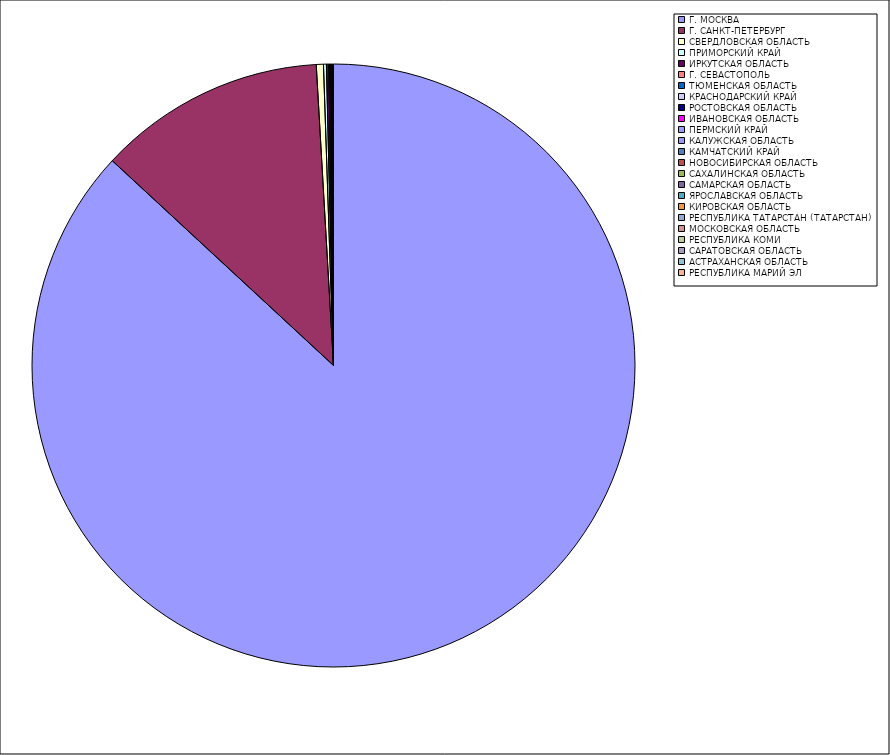
| Category | Оборот |
|---|---|
| Г. МОСКВА | 86.872 |
| Г. САНКТ-ПЕТЕРБУРГ | 12.199 |
| СВЕРДЛОВСКАЯ ОБЛАСТЬ | 0.382 |
| ПРИМОРСКИЙ КРАЙ | 0.156 |
| ИРКУТСКАЯ ОБЛАСТЬ | 0.12 |
| Г. СЕВАСТОПОЛЬ | 0.048 |
| ТЮМЕНСКАЯ ОБЛАСТЬ | 0.043 |
| КРАСНОДАРСКИЙ КРАЙ | 0.038 |
| РОСТОВСКАЯ ОБЛАСТЬ | 0.021 |
| ИВАНОВСКАЯ ОБЛАСТЬ | 0.019 |
| ПЕРМСКИЙ КРАЙ | 0.011 |
| КАЛУЖСКАЯ ОБЛАСТЬ | 0.011 |
| КАМЧАТСКИЙ КРАЙ | 0.009 |
| НОВОСИБИРСКАЯ ОБЛАСТЬ | 0.009 |
| САХАЛИНСКАЯ ОБЛАСТЬ | 0.008 |
| САМАРСКАЯ ОБЛАСТЬ | 0.006 |
| ЯРОСЛАВСКАЯ ОБЛАСТЬ | 0.006 |
| КИРОВСКАЯ ОБЛАСТЬ | 0.005 |
| РЕСПУБЛИКА ТАТАРСТАН (ТАТАРСТАН) | 0.005 |
| МОСКОВСКАЯ ОБЛАСТЬ | 0.005 |
| РЕСПУБЛИКА КОМИ | 0.004 |
| САРАТОВСКАЯ ОБЛАСТЬ | 0.003 |
| АСТРАХАНСКАЯ ОБЛАСТЬ | 0.002 |
| РЕСПУБЛИКА МАРИЙ ЭЛ | 0.002 |